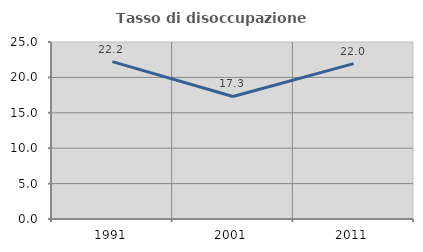
| Category | Tasso di disoccupazione giovanile  |
|---|---|
| 1991.0 | 22.222 |
| 2001.0 | 17.308 |
| 2011.0 | 21.951 |